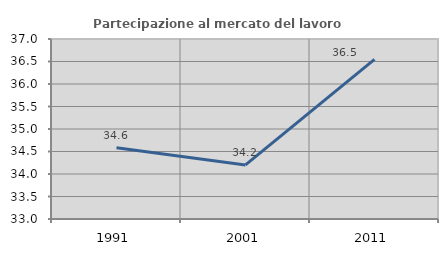
| Category | Partecipazione al mercato del lavoro  femminile |
|---|---|
| 1991.0 | 34.583 |
| 2001.0 | 34.201 |
| 2011.0 | 36.546 |